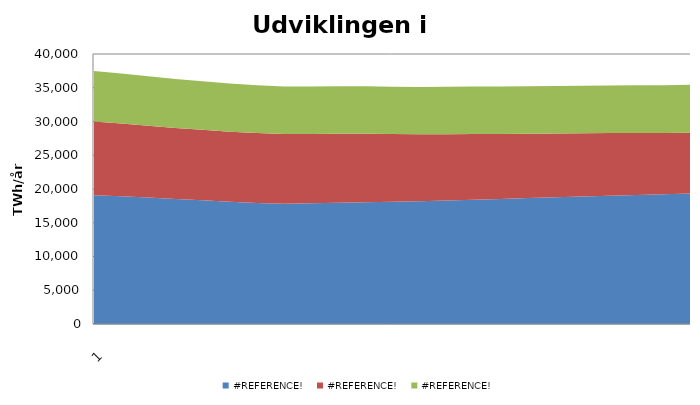
| Category | #REFERENCE! |
|---|---|
| 1.0 | 7495.647 |